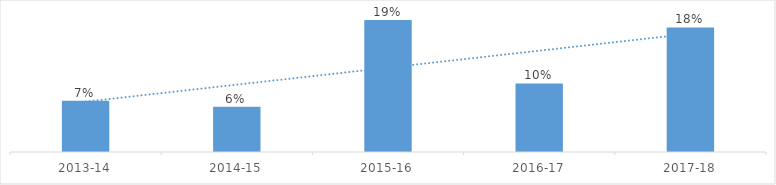
| Category | Series 0 |
|---|---|
| 2013-14 | 0.072 |
| 2014-15 | 0.064 |
| 2015-16 | 0.186 |
| 2016-17 | 0.096 |
| 2017-18 | 0.175 |